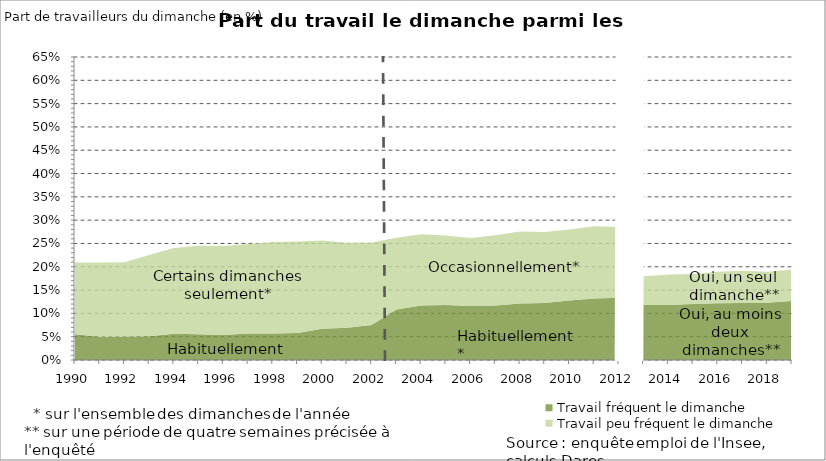
| Category | Travail fréquent le dimanche | Travail peu fréquent le dimanche |
|---|---|---|
| 1990.0 | 0.055 | 0.154 |
| 1991.0 | 0.05 | 0.16 |
| 1992.0 | 0.05 | 0.16 |
| 1993.0 | 0.051 | 0.174 |
| 1994.0 | 0.056 | 0.184 |
| 1995.0 | 0.055 | 0.19 |
| 1996.0 | 0.053 | 0.191 |
| 1997.0 | 0.057 | 0.192 |
| 1998.0 | 0.057 | 0.196 |
| 1999.0 | 0.058 | 0.196 |
| 2000.0 | 0.067 | 0.189 |
| 2001.0 | 0.069 | 0.183 |
| 2002.0 | 0.075 | 0.177 |
| 2003.0 | 0.108 | 0.154 |
| 2004.0 | 0.117 | 0.153 |
| 2005.0 | 0.118 | 0.149 |
| 2006.0 | 0.116 | 0.146 |
| 2007.0 | 0.117 | 0.151 |
| 2008.0 | 0.121 | 0.155 |
| 2009.0 | 0.122 | 0.152 |
| 2010.0 | 0.128 | 0.152 |
| 2011.0 | 0.132 | 0.155 |
| 2012.0 | 0.134 | 0.152 |
| 2013.0 | 0.118 | 0.062 |
| 2014.0 | 0.118 | 0.065 |
| 2015.0 | 0.12 | 0.065 |
| 2016.0 | 0.122 | 0.067 |
| 2017.0 | 0.123 | 0.069 |
| 2018.0 | 0.123 | 0.066 |
| 2019.0 | 0.126 | 0.067 |